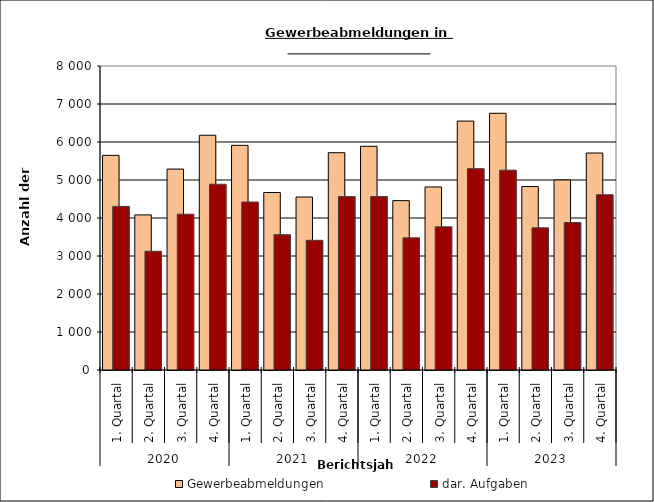
| Category | Gewerbeabmeldungen | dar. Aufgaben |
|---|---|---|
| 0 | 5648 | 4305 |
| 1 | 4082 | 3125 |
| 2 | 5288 | 4100 |
| 3 | 6178 | 4889 |
| 4 | 5912 | 4420 |
| 5 | 4671 | 3561 |
| 6 | 4552 | 3413 |
| 7 | 5718 | 4563 |
| 8 | 5887 | 4566 |
| 9 | 4457 | 3477 |
| 10 | 4817 | 3768 |
| 11 | 6550 | 5298 |
| 12 | 6756 | 5259 |
| 13 | 4828 | 3741 |
| 14 | 5001 | 3881 |
| 15 | 5710 | 4613 |